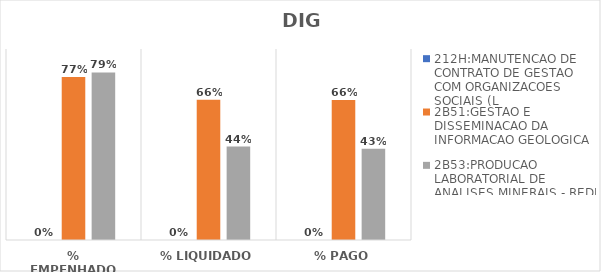
| Category | 212H:MANUTENCAO DE CONTRATO DE GESTAO COM ORGANIZACOES SOCIAIS (L | 2B51:GESTAO E DISSEMINACAO DA INFORMACAO GEOLOGICA | 2B53:PRODUCAO LABORATORIAL DE ANALISES MINERAIS - REDE LAMIN |
|---|---|---|---|
| % EMPENHADO | 0 | 0.768 | 0.79 |
| % LIQUIDADO | 0 | 0.661 | 0.441 |
| % PAGO | 0 | 0.66 | 0.43 |